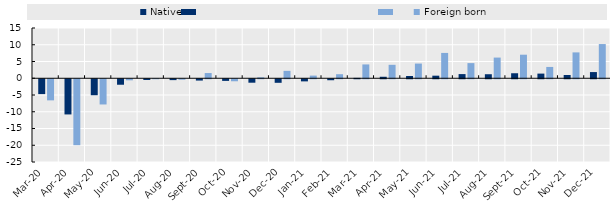
| Category | Native | Foreign born |
|---|---|---|
| 2020-03-01 | -4.433 | -6.301 |
| 2020-04-01 | -10.505 | -19.685 |
| 2020-05-01 | -4.771 | -7.528 |
| 2020-06-01 | -1.64 | -0.317 |
| 2020-07-01 | -0.226 | 0.004 |
| 2020-08-01 | -0.26 | -0.147 |
| 2020-09-01 | -0.393 | 1.553 |
| 2020-10-01 | -0.49 | -0.602 |
| 2020-11-01 | -1.032 | 0.278 |
| 2020-12-01 | -1.062 | 2.209 |
| 2021-01-01 | -0.634 | 0.792 |
| 2021-02-01 | -0.294 | 1.204 |
| 2021-03-01 | 0.115 | 4.127 |
| 2021-04-01 | 0.445 | 4.011 |
| 2021-05-01 | 0.664 | 4.382 |
| 2021-06-01 | 0.768 | 7.559 |
| 2021-07-01 | 1.241 | 4.515 |
| 2021-08-01 | 1.2 | 6.171 |
| 2021-09-01 | 1.494 | 7.03 |
| 2021-10-01 | 1.389 | 3.373 |
| 2021-11-01 | 0.975 | 7.718 |
| 2021-12-01 | 1.844 | 10.207 |